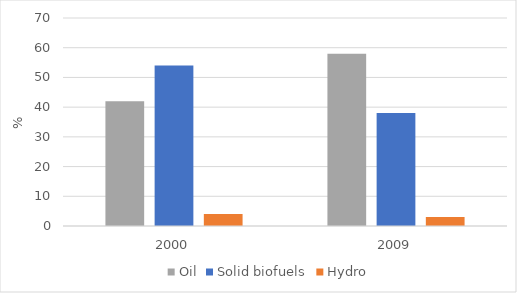
| Category | Oil | Solid biofuels | Hydro |
|---|---|---|---|
| 2000.0 | 42 | 54 | 4 |
| 2009.0 | 58 | 38 | 3 |